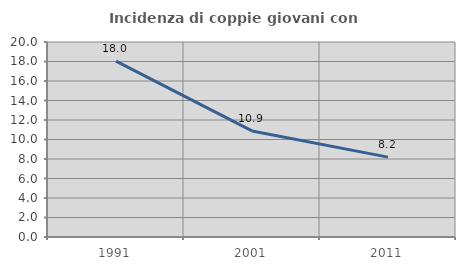
| Category | Incidenza di coppie giovani con figli |
|---|---|
| 1991.0 | 18.043 |
| 2001.0 | 10.881 |
| 2011.0 | 8.194 |